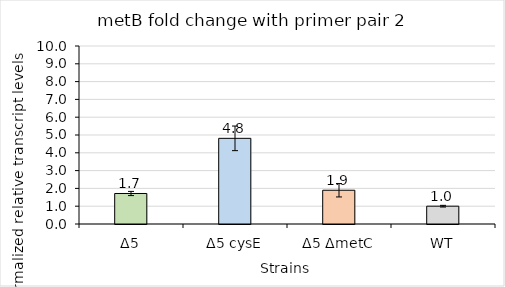
| Category | Δ5 Δ5 cysE Δ5 ΔmetC WT |
|---|---|
| Δ5 | 1.714 |
| Δ5 cysE | 4.812 |
| Δ5 ΔmetC | 1.896 |
| WT | 1.001 |